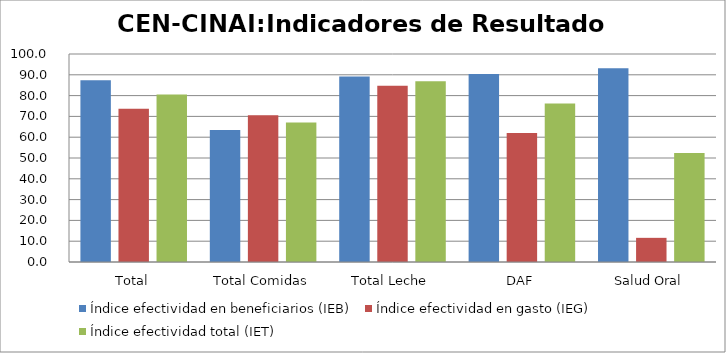
| Category | Índice efectividad en beneficiarios (IEB) | Índice efectividad en gasto (IEG)  | Índice efectividad total (IET) |
|---|---|---|---|
| Total | 87.341 | 73.705 | 80.523 |
| Total Comidas | 63.427 | 70.593 | 67.01 |
| Total Leche | 89.142 | 84.767 | 86.954 |
| DAF | 90.402 | 62.005 | 76.204 |
| Salud Oral | 93.15 | 11.615 | 52.383 |